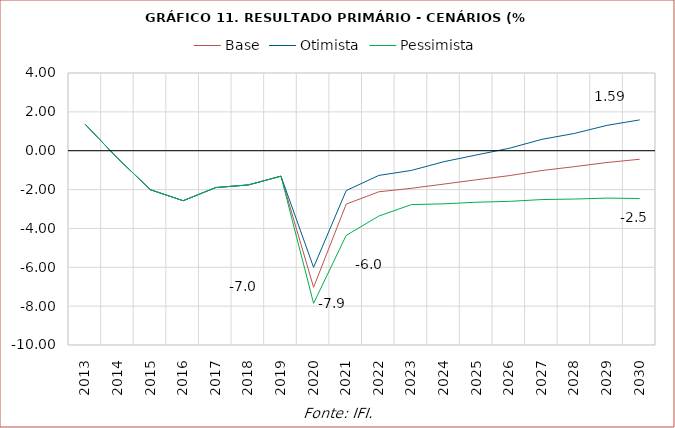
| Category | Base | Otimista | Pessimista |
|---|---|---|---|
| 2013.0 | 1.353 | 1.353 | 1.353 |
| 2014.0 | -0.406 | -0.406 | -0.406 |
| 2015.0 | -2.01 | -2.01 | -2.01 |
| 2016.0 | -2.573 | -2.573 | -2.573 |
| 2017.0 | -1.896 | -1.896 | -1.896 |
| 2018.0 | -1.761 | -1.761 | -1.761 |
| 2019.0 | -1.31 | -1.31 | -1.31 |
| 2020.0 | -7.028 | -6.004 | -7.857 |
| 2021.0 | -2.749 | -2.053 | -4.361 |
| 2022.0 | -2.114 | -1.272 | -3.364 |
| 2023.0 | -1.934 | -1.014 | -2.774 |
| 2024.0 | -1.716 | -0.563 | -2.734 |
| 2025.0 | -1.494 | -0.217 | -2.65 |
| 2026.0 | -1.283 | 0.125 | -2.607 |
| 2027.0 | -1.02 | 0.585 | -2.514 |
| 2028.0 | -0.821 | 0.889 | -2.487 |
| 2029.0 | -0.606 | 1.307 | -2.44 |
| 2030.0 | -0.439 | 1.587 | -2.46 |